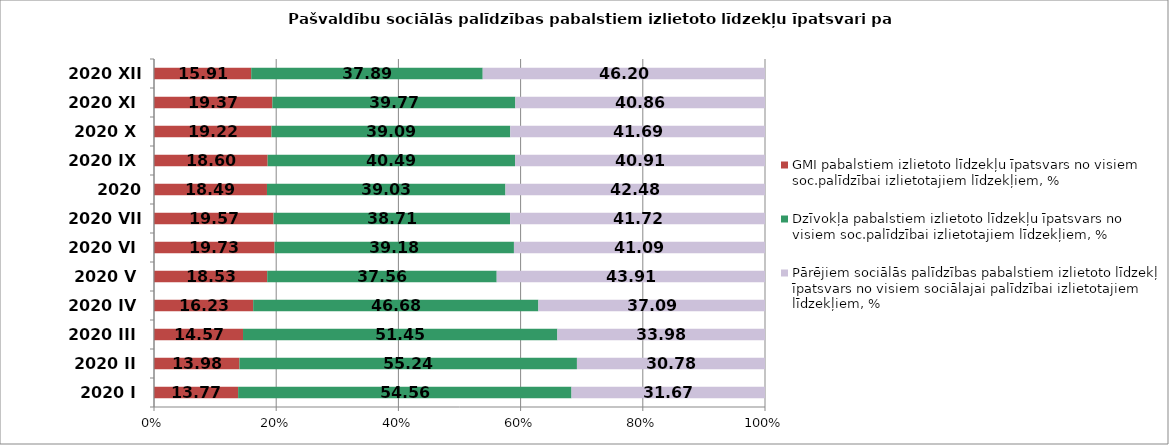
| Category | GMI pabalstiem izlietoto līdzekļu īpatsvars no visiem soc.palīdzībai izlietotajiem līdzekļiem, % | Dzīvokļa pabalstiem izlietoto līdzekļu īpatsvars no visiem soc.palīdzībai izlietotajiem līdzekļiem, % | Pārējiem sociālās palīdzības pabalstiem izlietoto līdzekļu īpatsvars no visiem sociālajai palīdzībai izlietotajiem līdzekļiem, % |
|---|---|---|---|
| 2020 I | 13.77 | 54.56 | 31.67 |
| 2020 II | 13.98 | 55.24 | 30.78 |
| 2020 III | 14.57 | 51.45 | 33.98 |
| 2020 IV | 16.23 | 46.68 | 37.09 |
| 2020 V | 18.53 | 37.56 | 43.91 |
| 2020 VI | 19.73 | 39.18 | 41.09 |
| 2020 VII | 19.57 | 38.71 | 41.72 |
| 2020 VIII | 18.49 | 39.03 | 42.48 |
| 2020 IX | 18.6 | 40.49 | 40.91 |
| 2020 X | 19.22 | 39.09 | 41.69 |
| 2020 XI | 19.37 | 39.77 | 40.86 |
| 2020 XII | 15.91 | 37.89 | 46.2 |